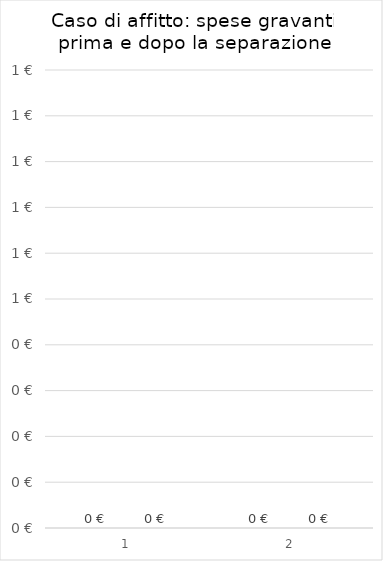
| Category | Prima | Dopo |
|---|---|---|
| 0 | 0 | 0 |
| 1 | 0 | 0 |